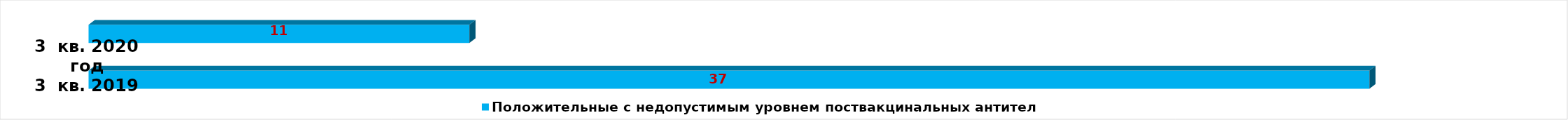
| Category | Положительные с недопустимым уровнем поствакцинальных антител |
|---|---|
| Положительные с недопустимым уровнем поствакцинальных антител | 37 |